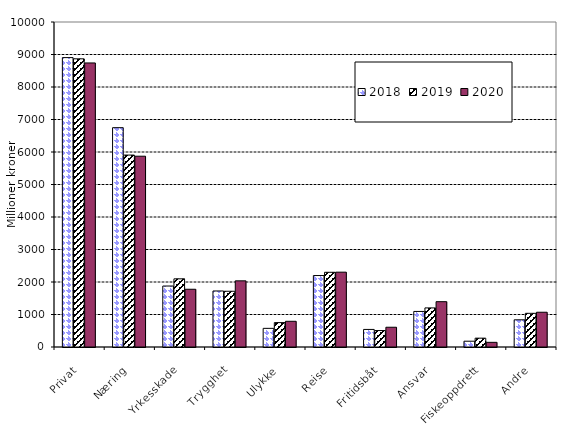
| Category | 2018 | 2019 | 2020 |
|---|---|---|---|
| Privat | 8904.377 | 8866.897 | 8740.354 |
| Næring | 6748.858 | 5905.407 | 5870.536 |
| Yrkesskade | 1876.31 | 2097.287 | 1776.833 |
| Trygghet | 1723.739 | 1715.016 | 2036.022 |
| Ulykke | 573.58 | 750.931 | 790.996 |
| Reise | 2198.861 | 2298.928 | 2302.566 |
| Fritidsbåt | 540.697 | 506.539 | 607.819 |
| Ansvar | 1093.968 | 1202.794 | 1394.395 |
| Fiskeoppdrett | 178.362 | 271.743 | 143.741 |
| Andre | 836.59 | 1036.461 | 1069.674 |